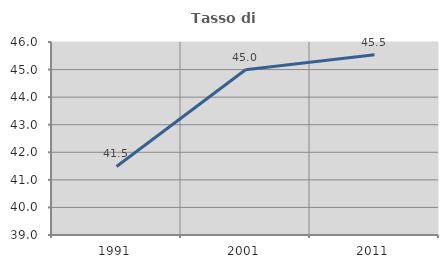
| Category | Tasso di occupazione   |
|---|---|
| 1991.0 | 41.486 |
| 2001.0 | 44.994 |
| 2011.0 | 45.537 |